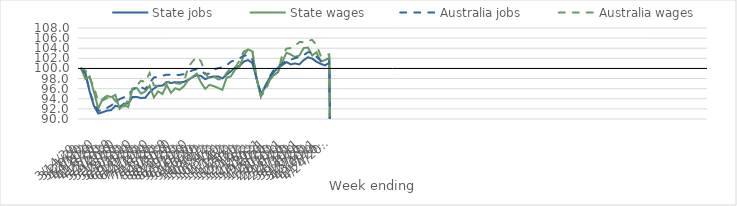
| Category | State jobs | State wages | Australia jobs | Australia wages |
|---|---|---|---|---|
| 14/03/2020 | 100 | 100 | 100 | 100 |
| 21/03/2020 | 99.119 | 97.888 | 98.971 | 99.607 |
| 28/03/2020 | 95.361 | 98.409 | 95.468 | 98.119 |
| 04/04/2020 | 92.588 | 95.309 | 92.921 | 96.261 |
| 11/04/2020 | 91.076 | 92.064 | 91.648 | 93.491 |
| 18/04/2020 | 91.324 | 93.938 | 91.631 | 93.695 |
| 25/04/2020 | 91.646 | 94.623 | 92.161 | 94.112 |
| 02/05/2020 | 91.739 | 94.329 | 92.658 | 94.685 |
| 09/05/2020 | 92.617 | 94.772 | 93.342 | 93.574 |
| 16/05/2020 | 92.398 | 92.019 | 93.935 | 92.809 |
| 23/05/2020 | 93.027 | 92.769 | 94.29 | 92.465 |
| 30/05/2020 | 93.062 | 92.356 | 94.796 | 93.818 |
| 06/06/2020 | 94.355 | 96.036 | 95.779 | 95.924 |
| 13/06/2020 | 94.361 | 96.15 | 96.278 | 96.597 |
| 20/06/2020 | 94.162 | 95.012 | 96.293 | 97.571 |
| 27/06/2020 | 94.209 | 95.462 | 95.898 | 97.324 |
| 04/07/2020 | 95.308 | 96.592 | 97.132 | 99.089 |
| 11/07/2020 | 96.015 | 94.265 | 98.221 | 96.668 |
| 18/07/2020 | 96.583 | 95.484 | 98.324 | 96.5 |
| 25/07/2020 | 96.605 | 94.936 | 98.548 | 96.312 |
| 01/08/2020 | 97.331 | 96.707 | 98.77 | 97.181 |
| 08/08/2020 | 97.11 | 95.17 | 98.766 | 97.601 |
| 15/08/2020 | 97.296 | 96.084 | 98.672 | 97.108 |
| 22/08/2020 | 97.239 | 95.765 | 98.73 | 96.964 |
| 29/08/2020 | 97.343 | 96.472 | 98.866 | 97.198 |
| 05/09/2020 | 97.731 | 97.645 | 99.166 | 100.215 |
| 12/09/2020 | 98.238 | 98.314 | 99.638 | 101.349 |
| 19/09/2020 | 98.661 | 98.968 | 99.835 | 102.253 |
| 26/09/2020 | 98.518 | 97.214 | 99.64 | 101.42 |
| 03/10/2020 | 97.866 | 95.955 | 98.855 | 99.138 |
| 10/10/2020 | 98.246 | 96.751 | 98.997 | 97.834 |
| 17/10/2020 | 98.428 | 96.488 | 99.767 | 98.431 |
| 24/10/2020 | 98.431 | 96.151 | 100.05 | 97.835 |
| 31/10/2020 | 98.014 | 95.757 | 100.228 | 97.89 |
| 07/11/2020 | 98.754 | 98.18 | 100.597 | 99.112 |
| 14/11/2020 | 99.416 | 98.44 | 101.334 | 100.12 |
| 21/11/2020 | 100.193 | 99.78 | 101.652 | 100.166 |
| 28/11/2020 | 100.498 | 100.35 | 101.968 | 101.522 |
| 05/12/2020 | 101.345 | 102.575 | 102.515 | 103.324 |
| 12/12/2020 | 101.66 | 103.773 | 102.583 | 103.755 |
| 19/12/2020 | 101.09 | 103.383 | 101.771 | 103.629 |
| 26/12/2020 | 98.044 | 97.908 | 97.972 | 98.159 |
| 02/01/2021 | 94.881 | 94.376 | 95.021 | 94.58 |
| 09/01/2021 | 96.502 | 96.428 | 96.246 | 95.443 |
| 16/01/2021 | 98.07 | 97.611 | 98.354 | 97.531 |
| 23/01/2021 | 99.26 | 98.652 | 99.666 | 98.597 |
| 30/01/2021 | 100.18 | 99.251 | 100.48 | 99.293 |
| 06/02/2021 | 100.653 | 101.292 | 100.907 | 102.696 |
| 13/02/2021 | 101.257 | 103.129 | 101.592 | 103.915 |
| 20/02/2021 | 100.803 | 102.729 | 101.718 | 104.04 |
| 27/02/2021 | 100.993 | 102.268 | 102.048 | 104.48 |
| 06/03/2021 | 100.797 | 102.568 | 102.273 | 105.217 |
| 13/03/2021 | 101.634 | 104.019 | 102.625 | 105.198 |
| 20/03/2021 | 102.209 | 104.152 | 103.203 | 105.516 |
| 27/03/2021 | 101.946 | 102.563 | 103.136 | 105.634 |
| 03/04/2021 | 101.331 | 103.202 | 102.34 | 104.641 |
| 10/04/2021 | 100.907 | 101.373 | 101.508 | 102.484 |
| 17/04/2021 | 100.617 | 101.64 | 101.424 | 102.692 |
| 24/04/2021 | 101.112 | 102.151 | 101.89 | 102.787 |